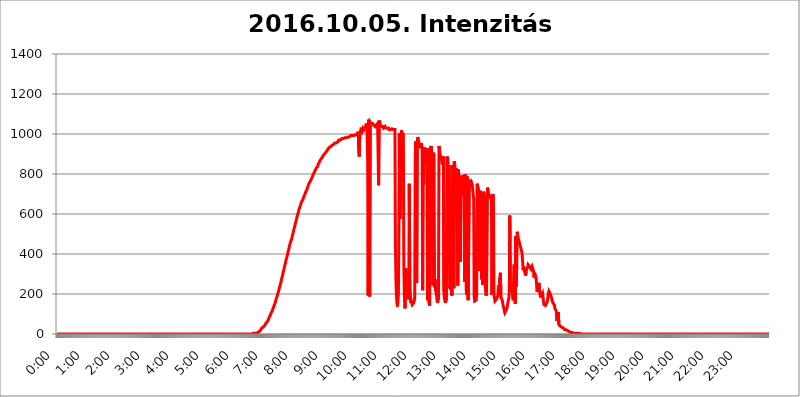
| Category | 2016.10.05. Intenzitás [W/m^2] |
|---|---|
| 0.0 | 0 |
| 0.0006944444444444445 | 0 |
| 0.001388888888888889 | 0 |
| 0.0020833333333333333 | 0 |
| 0.002777777777777778 | 0 |
| 0.003472222222222222 | 0 |
| 0.004166666666666667 | 0 |
| 0.004861111111111111 | 0 |
| 0.005555555555555556 | 0 |
| 0.0062499999999999995 | 0 |
| 0.006944444444444444 | 0 |
| 0.007638888888888889 | 0 |
| 0.008333333333333333 | 0 |
| 0.009027777777777779 | 0 |
| 0.009722222222222222 | 0 |
| 0.010416666666666666 | 0 |
| 0.011111111111111112 | 0 |
| 0.011805555555555555 | 0 |
| 0.012499999999999999 | 0 |
| 0.013194444444444444 | 0 |
| 0.013888888888888888 | 0 |
| 0.014583333333333332 | 0 |
| 0.015277777777777777 | 0 |
| 0.015972222222222224 | 0 |
| 0.016666666666666666 | 0 |
| 0.017361111111111112 | 0 |
| 0.018055555555555557 | 0 |
| 0.01875 | 0 |
| 0.019444444444444445 | 0 |
| 0.02013888888888889 | 0 |
| 0.020833333333333332 | 0 |
| 0.02152777777777778 | 0 |
| 0.022222222222222223 | 0 |
| 0.02291666666666667 | 0 |
| 0.02361111111111111 | 0 |
| 0.024305555555555556 | 0 |
| 0.024999999999999998 | 0 |
| 0.025694444444444447 | 0 |
| 0.02638888888888889 | 0 |
| 0.027083333333333334 | 0 |
| 0.027777777777777776 | 0 |
| 0.02847222222222222 | 0 |
| 0.029166666666666664 | 0 |
| 0.029861111111111113 | 0 |
| 0.030555555555555555 | 0 |
| 0.03125 | 0 |
| 0.03194444444444445 | 0 |
| 0.03263888888888889 | 0 |
| 0.03333333333333333 | 0 |
| 0.034027777777777775 | 0 |
| 0.034722222222222224 | 0 |
| 0.035416666666666666 | 0 |
| 0.036111111111111115 | 0 |
| 0.03680555555555556 | 0 |
| 0.0375 | 0 |
| 0.03819444444444444 | 0 |
| 0.03888888888888889 | 0 |
| 0.03958333333333333 | 0 |
| 0.04027777777777778 | 0 |
| 0.04097222222222222 | 0 |
| 0.041666666666666664 | 0 |
| 0.042361111111111106 | 0 |
| 0.04305555555555556 | 0 |
| 0.043750000000000004 | 0 |
| 0.044444444444444446 | 0 |
| 0.04513888888888889 | 0 |
| 0.04583333333333334 | 0 |
| 0.04652777777777778 | 0 |
| 0.04722222222222222 | 0 |
| 0.04791666666666666 | 0 |
| 0.04861111111111111 | 0 |
| 0.049305555555555554 | 0 |
| 0.049999999999999996 | 0 |
| 0.05069444444444445 | 0 |
| 0.051388888888888894 | 0 |
| 0.052083333333333336 | 0 |
| 0.05277777777777778 | 0 |
| 0.05347222222222222 | 0 |
| 0.05416666666666667 | 0 |
| 0.05486111111111111 | 0 |
| 0.05555555555555555 | 0 |
| 0.05625 | 0 |
| 0.05694444444444444 | 0 |
| 0.057638888888888885 | 0 |
| 0.05833333333333333 | 0 |
| 0.05902777777777778 | 0 |
| 0.059722222222222225 | 0 |
| 0.06041666666666667 | 0 |
| 0.061111111111111116 | 0 |
| 0.06180555555555556 | 0 |
| 0.0625 | 0 |
| 0.06319444444444444 | 0 |
| 0.06388888888888888 | 0 |
| 0.06458333333333334 | 0 |
| 0.06527777777777778 | 0 |
| 0.06597222222222222 | 0 |
| 0.06666666666666667 | 0 |
| 0.06736111111111111 | 0 |
| 0.06805555555555555 | 0 |
| 0.06874999999999999 | 0 |
| 0.06944444444444443 | 0 |
| 0.07013888888888889 | 0 |
| 0.07083333333333333 | 0 |
| 0.07152777777777779 | 0 |
| 0.07222222222222223 | 0 |
| 0.07291666666666667 | 0 |
| 0.07361111111111111 | 0 |
| 0.07430555555555556 | 0 |
| 0.075 | 0 |
| 0.07569444444444444 | 0 |
| 0.0763888888888889 | 0 |
| 0.07708333333333334 | 0 |
| 0.07777777777777778 | 0 |
| 0.07847222222222222 | 0 |
| 0.07916666666666666 | 0 |
| 0.0798611111111111 | 0 |
| 0.08055555555555556 | 0 |
| 0.08125 | 0 |
| 0.08194444444444444 | 0 |
| 0.08263888888888889 | 0 |
| 0.08333333333333333 | 0 |
| 0.08402777777777777 | 0 |
| 0.08472222222222221 | 0 |
| 0.08541666666666665 | 0 |
| 0.08611111111111112 | 0 |
| 0.08680555555555557 | 0 |
| 0.08750000000000001 | 0 |
| 0.08819444444444445 | 0 |
| 0.08888888888888889 | 0 |
| 0.08958333333333333 | 0 |
| 0.09027777777777778 | 0 |
| 0.09097222222222222 | 0 |
| 0.09166666666666667 | 0 |
| 0.09236111111111112 | 0 |
| 0.09305555555555556 | 0 |
| 0.09375 | 0 |
| 0.09444444444444444 | 0 |
| 0.09513888888888888 | 0 |
| 0.09583333333333333 | 0 |
| 0.09652777777777777 | 0 |
| 0.09722222222222222 | 0 |
| 0.09791666666666667 | 0 |
| 0.09861111111111111 | 0 |
| 0.09930555555555555 | 0 |
| 0.09999999999999999 | 0 |
| 0.10069444444444443 | 0 |
| 0.1013888888888889 | 0 |
| 0.10208333333333335 | 0 |
| 0.10277777777777779 | 0 |
| 0.10347222222222223 | 0 |
| 0.10416666666666667 | 0 |
| 0.10486111111111111 | 0 |
| 0.10555555555555556 | 0 |
| 0.10625 | 0 |
| 0.10694444444444444 | 0 |
| 0.1076388888888889 | 0 |
| 0.10833333333333334 | 0 |
| 0.10902777777777778 | 0 |
| 0.10972222222222222 | 0 |
| 0.1111111111111111 | 0 |
| 0.11180555555555556 | 0 |
| 0.11180555555555556 | 0 |
| 0.1125 | 0 |
| 0.11319444444444444 | 0 |
| 0.11388888888888889 | 0 |
| 0.11458333333333333 | 0 |
| 0.11527777777777777 | 0 |
| 0.11597222222222221 | 0 |
| 0.11666666666666665 | 0 |
| 0.1173611111111111 | 0 |
| 0.11805555555555557 | 0 |
| 0.11944444444444445 | 0 |
| 0.12013888888888889 | 0 |
| 0.12083333333333333 | 0 |
| 0.12152777777777778 | 0 |
| 0.12222222222222223 | 0 |
| 0.12291666666666667 | 0 |
| 0.12291666666666667 | 0 |
| 0.12361111111111112 | 0 |
| 0.12430555555555556 | 0 |
| 0.125 | 0 |
| 0.12569444444444444 | 0 |
| 0.12638888888888888 | 0 |
| 0.12708333333333333 | 0 |
| 0.16875 | 0 |
| 0.12847222222222224 | 0 |
| 0.12916666666666668 | 0 |
| 0.12986111111111112 | 0 |
| 0.13055555555555556 | 0 |
| 0.13125 | 0 |
| 0.13194444444444445 | 0 |
| 0.1326388888888889 | 0 |
| 0.13333333333333333 | 0 |
| 0.13402777777777777 | 0 |
| 0.13402777777777777 | 0 |
| 0.13472222222222222 | 0 |
| 0.13541666666666666 | 0 |
| 0.1361111111111111 | 0 |
| 0.13749999999999998 | 0 |
| 0.13819444444444443 | 0 |
| 0.1388888888888889 | 0 |
| 0.13958333333333334 | 0 |
| 0.14027777777777778 | 0 |
| 0.14097222222222222 | 0 |
| 0.14166666666666666 | 0 |
| 0.1423611111111111 | 0 |
| 0.14305555555555557 | 0 |
| 0.14375000000000002 | 0 |
| 0.14444444444444446 | 0 |
| 0.1451388888888889 | 0 |
| 0.1451388888888889 | 0 |
| 0.14652777777777778 | 0 |
| 0.14722222222222223 | 0 |
| 0.14791666666666667 | 0 |
| 0.1486111111111111 | 0 |
| 0.14930555555555555 | 0 |
| 0.15 | 0 |
| 0.15069444444444444 | 0 |
| 0.15138888888888888 | 0 |
| 0.15208333333333332 | 0 |
| 0.15277777777777776 | 0 |
| 0.15347222222222223 | 0 |
| 0.15416666666666667 | 0 |
| 0.15486111111111112 | 0 |
| 0.15555555555555556 | 0 |
| 0.15625 | 0 |
| 0.15694444444444444 | 0 |
| 0.15763888888888888 | 0 |
| 0.15833333333333333 | 0 |
| 0.15902777777777777 | 0 |
| 0.15972222222222224 | 0 |
| 0.16041666666666668 | 0 |
| 0.16111111111111112 | 0 |
| 0.16180555555555556 | 0 |
| 0.1625 | 0 |
| 0.16319444444444445 | 0 |
| 0.1638888888888889 | 0 |
| 0.16458333333333333 | 0 |
| 0.16527777777777777 | 0 |
| 0.16597222222222222 | 0 |
| 0.16666666666666666 | 0 |
| 0.1673611111111111 | 0 |
| 0.16805555555555554 | 0 |
| 0.16874999999999998 | 0 |
| 0.16944444444444443 | 0 |
| 0.17013888888888887 | 0 |
| 0.1708333333333333 | 0 |
| 0.17152777777777775 | 0 |
| 0.17222222222222225 | 0 |
| 0.1729166666666667 | 0 |
| 0.17361111111111113 | 0 |
| 0.17430555555555557 | 0 |
| 0.17500000000000002 | 0 |
| 0.17569444444444446 | 0 |
| 0.1763888888888889 | 0 |
| 0.17708333333333334 | 0 |
| 0.17777777777777778 | 0 |
| 0.17847222222222223 | 0 |
| 0.17916666666666667 | 0 |
| 0.1798611111111111 | 0 |
| 0.18055555555555555 | 0 |
| 0.18125 | 0 |
| 0.18194444444444444 | 0 |
| 0.1826388888888889 | 0 |
| 0.18333333333333335 | 0 |
| 0.1840277777777778 | 0 |
| 0.18472222222222223 | 0 |
| 0.18541666666666667 | 0 |
| 0.18611111111111112 | 0 |
| 0.18680555555555556 | 0 |
| 0.1875 | 0 |
| 0.18819444444444444 | 0 |
| 0.18888888888888888 | 0 |
| 0.18958333333333333 | 0 |
| 0.19027777777777777 | 0 |
| 0.1909722222222222 | 0 |
| 0.19166666666666665 | 0 |
| 0.19236111111111112 | 0 |
| 0.19305555555555554 | 0 |
| 0.19375 | 0 |
| 0.19444444444444445 | 0 |
| 0.1951388888888889 | 0 |
| 0.19583333333333333 | 0 |
| 0.19652777777777777 | 0 |
| 0.19722222222222222 | 0 |
| 0.19791666666666666 | 0 |
| 0.1986111111111111 | 0 |
| 0.19930555555555554 | 0 |
| 0.19999999999999998 | 0 |
| 0.20069444444444443 | 0 |
| 0.20138888888888887 | 0 |
| 0.2020833333333333 | 0 |
| 0.2027777777777778 | 0 |
| 0.2034722222222222 | 0 |
| 0.2041666666666667 | 0 |
| 0.20486111111111113 | 0 |
| 0.20555555555555557 | 0 |
| 0.20625000000000002 | 0 |
| 0.20694444444444446 | 0 |
| 0.2076388888888889 | 0 |
| 0.20833333333333334 | 0 |
| 0.20902777777777778 | 0 |
| 0.20972222222222223 | 0 |
| 0.21041666666666667 | 0 |
| 0.2111111111111111 | 0 |
| 0.21180555555555555 | 0 |
| 0.2125 | 0 |
| 0.21319444444444444 | 0 |
| 0.2138888888888889 | 0 |
| 0.21458333333333335 | 0 |
| 0.2152777777777778 | 0 |
| 0.21597222222222223 | 0 |
| 0.21666666666666667 | 0 |
| 0.21736111111111112 | 0 |
| 0.21805555555555556 | 0 |
| 0.21875 | 0 |
| 0.21944444444444444 | 0 |
| 0.22013888888888888 | 0 |
| 0.22083333333333333 | 0 |
| 0.22152777777777777 | 0 |
| 0.2222222222222222 | 0 |
| 0.22291666666666665 | 0 |
| 0.2236111111111111 | 0 |
| 0.22430555555555556 | 0 |
| 0.225 | 0 |
| 0.22569444444444445 | 0 |
| 0.2263888888888889 | 0 |
| 0.22708333333333333 | 0 |
| 0.22777777777777777 | 0 |
| 0.22847222222222222 | 0 |
| 0.22916666666666666 | 0 |
| 0.2298611111111111 | 0 |
| 0.23055555555555554 | 0 |
| 0.23124999999999998 | 0 |
| 0.23194444444444443 | 0 |
| 0.23263888888888887 | 0 |
| 0.2333333333333333 | 0 |
| 0.2340277777777778 | 0 |
| 0.2347222222222222 | 0 |
| 0.2354166666666667 | 0 |
| 0.23611111111111113 | 0 |
| 0.23680555555555557 | 0 |
| 0.23750000000000002 | 0 |
| 0.23819444444444446 | 0 |
| 0.2388888888888889 | 0 |
| 0.23958333333333334 | 0 |
| 0.24027777777777778 | 0 |
| 0.24097222222222223 | 0 |
| 0.24166666666666667 | 0 |
| 0.2423611111111111 | 0 |
| 0.24305555555555555 | 0 |
| 0.24375 | 0 |
| 0.24444444444444446 | 0 |
| 0.24513888888888888 | 0 |
| 0.24583333333333335 | 0 |
| 0.2465277777777778 | 0 |
| 0.24722222222222223 | 0 |
| 0.24791666666666667 | 0 |
| 0.24861111111111112 | 0 |
| 0.24930555555555556 | 0 |
| 0.25 | 0 |
| 0.25069444444444444 | 0 |
| 0.2513888888888889 | 0 |
| 0.2520833333333333 | 0 |
| 0.25277777777777777 | 0 |
| 0.2534722222222222 | 0 |
| 0.25416666666666665 | 0 |
| 0.2548611111111111 | 0 |
| 0.2555555555555556 | 0 |
| 0.25625000000000003 | 0 |
| 0.2569444444444445 | 0 |
| 0.2576388888888889 | 0 |
| 0.25833333333333336 | 0 |
| 0.2590277777777778 | 0 |
| 0.25972222222222224 | 0 |
| 0.2604166666666667 | 0 |
| 0.2611111111111111 | 0 |
| 0.26180555555555557 | 0 |
| 0.2625 | 0 |
| 0.26319444444444445 | 0 |
| 0.2638888888888889 | 0 |
| 0.26458333333333334 | 0 |
| 0.2652777777777778 | 0 |
| 0.2659722222222222 | 0 |
| 0.26666666666666666 | 0 |
| 0.2673611111111111 | 0 |
| 0.26805555555555555 | 0 |
| 0.26875 | 0 |
| 0.26944444444444443 | 0 |
| 0.2701388888888889 | 0 |
| 0.2708333333333333 | 0 |
| 0.27152777777777776 | 0 |
| 0.2722222222222222 | 0 |
| 0.27291666666666664 | 0 |
| 0.2736111111111111 | 0 |
| 0.2743055555555555 | 3.525 |
| 0.27499999999999997 | 3.525 |
| 0.27569444444444446 | 3.525 |
| 0.27638888888888885 | 3.525 |
| 0.27708333333333335 | 3.525 |
| 0.2777777777777778 | 3.525 |
| 0.27847222222222223 | 3.525 |
| 0.2791666666666667 | 3.525 |
| 0.2798611111111111 | 3.525 |
| 0.28055555555555556 | 7.887 |
| 0.28125 | 7.887 |
| 0.28194444444444444 | 7.887 |
| 0.2826388888888889 | 12.257 |
| 0.2833333333333333 | 12.257 |
| 0.28402777777777777 | 12.257 |
| 0.2847222222222222 | 12.257 |
| 0.28541666666666665 | 21.024 |
| 0.28611111111111115 | 25.419 |
| 0.28680555555555554 | 29.823 |
| 0.28750000000000003 | 29.823 |
| 0.2881944444444445 | 34.234 |
| 0.2888888888888889 | 34.234 |
| 0.28958333333333336 | 38.653 |
| 0.2902777777777778 | 38.653 |
| 0.29097222222222224 | 43.079 |
| 0.2916666666666667 | 47.511 |
| 0.2923611111111111 | 51.951 |
| 0.29305555555555557 | 56.398 |
| 0.29375 | 56.398 |
| 0.29444444444444445 | 60.85 |
| 0.2951388888888889 | 65.31 |
| 0.29583333333333334 | 69.775 |
| 0.2965277777777778 | 74.246 |
| 0.2972222222222222 | 83.205 |
| 0.29791666666666666 | 87.692 |
| 0.2986111111111111 | 92.184 |
| 0.29930555555555555 | 96.682 |
| 0.3 | 105.69 |
| 0.30069444444444443 | 110.201 |
| 0.3013888888888889 | 114.716 |
| 0.3020833333333333 | 119.235 |
| 0.30277777777777776 | 128.284 |
| 0.3034722222222222 | 132.814 |
| 0.30416666666666664 | 141.884 |
| 0.3048611111111111 | 146.423 |
| 0.3055555555555555 | 155.509 |
| 0.30624999999999997 | 160.056 |
| 0.3069444444444444 | 173.709 |
| 0.3076388888888889 | 178.264 |
| 0.30833333333333335 | 187.378 |
| 0.3090277777777778 | 196.497 |
| 0.30972222222222223 | 205.62 |
| 0.3104166666666667 | 214.746 |
| 0.3111111111111111 | 223.873 |
| 0.31180555555555556 | 233 |
| 0.3125 | 242.127 |
| 0.31319444444444444 | 251.251 |
| 0.3138888888888889 | 260.373 |
| 0.3145833333333333 | 274.047 |
| 0.31527777777777777 | 283.156 |
| 0.3159722222222222 | 292.259 |
| 0.31666666666666665 | 305.898 |
| 0.31736111111111115 | 314.98 |
| 0.31805555555555554 | 324.052 |
| 0.31875000000000003 | 337.639 |
| 0.3194444444444445 | 346.682 |
| 0.3201388888888889 | 355.712 |
| 0.32083333333333336 | 369.23 |
| 0.3215277777777778 | 378.224 |
| 0.32222222222222224 | 387.202 |
| 0.3229166666666667 | 396.164 |
| 0.3236111111111111 | 409.574 |
| 0.32430555555555557 | 418.492 |
| 0.325 | 427.39 |
| 0.32569444444444445 | 440.702 |
| 0.3263888888888889 | 449.551 |
| 0.32708333333333334 | 458.38 |
| 0.3277777777777778 | 462.786 |
| 0.3284722222222222 | 471.582 |
| 0.32916666666666666 | 480.356 |
| 0.3298611111111111 | 493.475 |
| 0.33055555555555555 | 502.192 |
| 0.33125 | 510.885 |
| 0.33194444444444443 | 523.88 |
| 0.3326388888888889 | 532.513 |
| 0.3333333333333333 | 541.121 |
| 0.3340277777777778 | 553.986 |
| 0.3347222222222222 | 558.261 |
| 0.3354166666666667 | 571.049 |
| 0.3361111111111111 | 583.779 |
| 0.3368055555555556 | 592.233 |
| 0.33749999999999997 | 600.661 |
| 0.33819444444444446 | 609.062 |
| 0.33888888888888885 | 621.613 |
| 0.33958333333333335 | 625.784 |
| 0.34027777777777773 | 634.105 |
| 0.34097222222222223 | 642.4 |
| 0.3416666666666666 | 646.537 |
| 0.3423611111111111 | 658.909 |
| 0.3430555555555555 | 663.019 |
| 0.34375 | 663.019 |
| 0.3444444444444445 | 671.22 |
| 0.3451388888888889 | 679.395 |
| 0.3458333333333334 | 683.473 |
| 0.34652777777777777 | 691.608 |
| 0.34722222222222227 | 695.666 |
| 0.34791666666666665 | 703.762 |
| 0.34861111111111115 | 711.832 |
| 0.34930555555555554 | 715.858 |
| 0.35000000000000003 | 719.877 |
| 0.3506944444444444 | 727.896 |
| 0.3513888888888889 | 735.89 |
| 0.3520833333333333 | 743.859 |
| 0.3527777777777778 | 743.859 |
| 0.3534722222222222 | 747.834 |
| 0.3541666666666667 | 759.723 |
| 0.3548611111111111 | 763.674 |
| 0.35555555555555557 | 767.62 |
| 0.35625 | 771.559 |
| 0.35694444444444445 | 779.42 |
| 0.3576388888888889 | 783.342 |
| 0.35833333333333334 | 791.169 |
| 0.3590277777777778 | 798.974 |
| 0.3597222222222222 | 802.868 |
| 0.36041666666666666 | 806.757 |
| 0.3611111111111111 | 814.519 |
| 0.36180555555555555 | 818.392 |
| 0.3625 | 822.26 |
| 0.36319444444444443 | 829.981 |
| 0.3638888888888889 | 833.834 |
| 0.3645833333333333 | 833.834 |
| 0.3652777777777778 | 837.682 |
| 0.3659722222222222 | 849.199 |
| 0.3666666666666667 | 853.029 |
| 0.3673611111111111 | 856.855 |
| 0.3680555555555556 | 864.493 |
| 0.36874999999999997 | 864.493 |
| 0.36944444444444446 | 872.114 |
| 0.37013888888888885 | 872.114 |
| 0.37083333333333335 | 875.918 |
| 0.37152777777777773 | 883.516 |
| 0.37222222222222223 | 887.309 |
| 0.3729166666666666 | 891.099 |
| 0.3736111111111111 | 894.885 |
| 0.3743055555555555 | 898.668 |
| 0.375 | 894.885 |
| 0.3756944444444445 | 902.447 |
| 0.3763888888888889 | 906.223 |
| 0.3770833333333334 | 906.223 |
| 0.37777777777777777 | 913.766 |
| 0.37847222222222227 | 917.534 |
| 0.37916666666666665 | 917.534 |
| 0.37986111111111115 | 925.06 |
| 0.38055555555555554 | 928.819 |
| 0.38125000000000003 | 932.576 |
| 0.3819444444444444 | 932.576 |
| 0.3826388888888889 | 932.576 |
| 0.3833333333333333 | 936.33 |
| 0.3840277777777778 | 936.33 |
| 0.3847222222222222 | 940.082 |
| 0.3854166666666667 | 943.832 |
| 0.3861111111111111 | 943.832 |
| 0.38680555555555557 | 943.832 |
| 0.3875 | 947.58 |
| 0.38819444444444445 | 951.327 |
| 0.3888888888888889 | 955.071 |
| 0.38958333333333334 | 955.071 |
| 0.3902777777777778 | 958.814 |
| 0.3909722222222222 | 955.071 |
| 0.39166666666666666 | 958.814 |
| 0.3923611111111111 | 958.814 |
| 0.39305555555555555 | 958.814 |
| 0.39375 | 962.555 |
| 0.39444444444444443 | 962.555 |
| 0.3951388888888889 | 970.034 |
| 0.3958333333333333 | 970.034 |
| 0.3965277777777778 | 973.772 |
| 0.3972222222222222 | 970.034 |
| 0.3979166666666667 | 973.772 |
| 0.3986111111111111 | 973.772 |
| 0.3993055555555556 | 977.508 |
| 0.39999999999999997 | 973.772 |
| 0.40069444444444446 | 977.508 |
| 0.40138888888888885 | 977.508 |
| 0.40208333333333335 | 977.508 |
| 0.40277777777777773 | 977.508 |
| 0.40347222222222223 | 981.244 |
| 0.4041666666666666 | 984.98 |
| 0.4048611111111111 | 984.98 |
| 0.4055555555555555 | 981.244 |
| 0.40625 | 984.98 |
| 0.4069444444444445 | 984.98 |
| 0.4076388888888889 | 984.98 |
| 0.4083333333333334 | 984.98 |
| 0.40902777777777777 | 984.98 |
| 0.40972222222222227 | 984.98 |
| 0.41041666666666665 | 984.98 |
| 0.41111111111111115 | 984.98 |
| 0.41180555555555554 | 992.448 |
| 0.41250000000000003 | 988.714 |
| 0.4131944444444444 | 988.714 |
| 0.4138888888888889 | 992.448 |
| 0.4145833333333333 | 988.714 |
| 0.4152777777777778 | 992.448 |
| 0.4159722222222222 | 992.448 |
| 0.4166666666666667 | 992.448 |
| 0.4173611111111111 | 996.182 |
| 0.41805555555555557 | 996.182 |
| 0.41875 | 992.448 |
| 0.41944444444444445 | 996.182 |
| 0.4201388888888889 | 996.182 |
| 0.42083333333333334 | 992.448 |
| 0.4215277777777778 | 996.182 |
| 0.4222222222222222 | 1011.118 |
| 0.42291666666666666 | 917.534 |
| 0.4236111111111111 | 887.309 |
| 0.42430555555555555 | 1011.118 |
| 0.425 | 1003.65 |
| 0.42569444444444443 | 1018.587 |
| 0.4263888888888889 | 1014.852 |
| 0.4270833333333333 | 1011.118 |
| 0.4277777777777778 | 1022.323 |
| 0.4284722222222222 | 1029.798 |
| 0.4291666666666667 | 1026.06 |
| 0.4298611111111111 | 1022.323 |
| 0.4305555555555556 | 1029.798 |
| 0.43124999999999997 | 1029.798 |
| 0.43194444444444446 | 1033.537 |
| 0.43263888888888885 | 1037.277 |
| 0.43333333333333335 | 1052.255 |
| 0.43402777777777773 | 1037.277 |
| 0.43472222222222223 | 996.182 |
| 0.4354166666666666 | 849.199 |
| 0.4361111111111111 | 191.937 |
| 0.4368055555555555 | 1071.027 |
| 0.4375 | 856.855 |
| 0.4381944444444445 | 187.378 |
| 0.4388888888888889 | 1059.756 |
| 0.4395833333333334 | 1059.756 |
| 0.44027777777777777 | 1052.255 |
| 0.44097222222222227 | 1052.255 |
| 0.44166666666666665 | 1052.255 |
| 0.44236111111111115 | 1052.255 |
| 0.44305555555555554 | 1048.508 |
| 0.44375000000000003 | 1044.762 |
| 0.4444444444444444 | 1044.762 |
| 0.4451388888888889 | 1041.019 |
| 0.4458333333333333 | 1037.277 |
| 0.4465277777777778 | 1041.019 |
| 0.4472222222222222 | 1044.762 |
| 0.4479166666666667 | 1041.019 |
| 0.4486111111111111 | 1044.762 |
| 0.44930555555555557 | 1052.255 |
| 0.45 | 1052.255 |
| 0.45069444444444445 | 743.859 |
| 0.4513888888888889 | 1067.267 |
| 0.45208333333333334 | 1063.51 |
| 0.4527777777777778 | 1052.255 |
| 0.4534722222222222 | 1044.762 |
| 0.45416666666666666 | 1044.762 |
| 0.4548611111111111 | 1037.277 |
| 0.45555555555555555 | 1037.277 |
| 0.45625 | 1037.277 |
| 0.45694444444444443 | 1037.277 |
| 0.4576388888888889 | 1029.798 |
| 0.4583333333333333 | 1029.798 |
| 0.4590277777777778 | 1033.537 |
| 0.4597222222222222 | 1037.277 |
| 0.4604166666666667 | 1029.798 |
| 0.4611111111111111 | 1033.537 |
| 0.4618055555555556 | 1033.537 |
| 0.46249999999999997 | 1029.798 |
| 0.46319444444444446 | 1033.537 |
| 0.46388888888888885 | 1033.537 |
| 0.46458333333333335 | 1029.798 |
| 0.46527777777777773 | 1022.323 |
| 0.46597222222222223 | 1022.323 |
| 0.4666666666666666 | 1022.323 |
| 0.4673611111111111 | 1022.323 |
| 0.4680555555555555 | 1022.323 |
| 0.46875 | 1022.323 |
| 0.4694444444444445 | 1026.06 |
| 0.4701388888888889 | 1029.798 |
| 0.4708333333333334 | 1026.06 |
| 0.47152777777777777 | 1022.323 |
| 0.47222222222222227 | 1018.587 |
| 0.47291666666666665 | 1022.323 |
| 0.47361111111111115 | 1022.323 |
| 0.47430555555555554 | 445.129 |
| 0.47500000000000003 | 278.603 |
| 0.4756944444444444 | 196.497 |
| 0.4763888888888889 | 155.509 |
| 0.4770833333333333 | 137.347 |
| 0.4777777777777778 | 164.605 |
| 0.4784722222222222 | 196.497 |
| 0.4791666666666667 | 515.223 |
| 0.4798611111111111 | 1003.65 |
| 0.48055555555555557 | 575.299 |
| 0.48125 | 747.834 |
| 0.48194444444444445 | 925.06 |
| 0.4826388888888889 | 1018.587 |
| 0.48333333333333334 | 1007.383 |
| 0.4840277777777778 | 1007.383 |
| 0.4847222222222222 | 1007.383 |
| 0.48541666666666666 | 999.916 |
| 0.4861111111111111 | 342.162 |
| 0.48680555555555555 | 201.058 |
| 0.4875 | 128.284 |
| 0.48819444444444443 | 141.884 |
| 0.4888888888888889 | 328.584 |
| 0.4895833333333333 | 187.378 |
| 0.4902777777777778 | 210.182 |
| 0.4909722222222222 | 182.82 |
| 0.4916666666666667 | 173.709 |
| 0.4923611111111111 | 191.937 |
| 0.4930555555555556 | 210.182 |
| 0.49374999999999997 | 751.803 |
| 0.49444444444444446 | 296.808 |
| 0.49513888888888885 | 196.497 |
| 0.49583333333333335 | 155.509 |
| 0.49652777777777773 | 164.605 |
| 0.49722222222222223 | 155.509 |
| 0.4979166666666666 | 146.423 |
| 0.4986111111111111 | 150.964 |
| 0.4993055555555555 | 150.964 |
| 0.5 | 155.509 |
| 0.5006944444444444 | 164.605 |
| 0.5013888888888889 | 187.378 |
| 0.5020833333333333 | 875.918 |
| 0.5027777777777778 | 962.555 |
| 0.5034722222222222 | 296.808 |
| 0.5041666666666667 | 255.813 |
| 0.5048611111111111 | 955.071 |
| 0.5055555555555555 | 984.98 |
| 0.50625 | 973.772 |
| 0.5069444444444444 | 962.555 |
| 0.5076388888888889 | 951.327 |
| 0.5083333333333333 | 947.58 |
| 0.5090277777777777 | 940.082 |
| 0.5097222222222222 | 928.819 |
| 0.5104166666666666 | 955.071 |
| 0.5111111111111112 | 943.832 |
| 0.5118055555555555 | 932.576 |
| 0.5125000000000001 | 219.309 |
| 0.5131944444444444 | 932.576 |
| 0.513888888888889 | 747.834 |
| 0.5145833333333333 | 932.576 |
| 0.5152777777777778 | 928.819 |
| 0.5159722222222222 | 921.298 |
| 0.5166666666666667 | 909.996 |
| 0.517361111111111 | 925.06 |
| 0.5180555555555556 | 853.029 |
| 0.5187499999999999 | 928.819 |
| 0.5194444444444445 | 169.156 |
| 0.5201388888888888 | 178.264 |
| 0.5208333333333334 | 872.114 |
| 0.5215277777777778 | 155.509 |
| 0.5222222222222223 | 141.884 |
| 0.5229166666666667 | 887.309 |
| 0.5236111111111111 | 932.576 |
| 0.5243055555555556 | 940.082 |
| 0.525 | 943.832 |
| 0.5256944444444445 | 883.516 |
| 0.5263888888888889 | 440.702 |
| 0.5270833333333333 | 242.127 |
| 0.5277777777777778 | 906.223 |
| 0.5284722222222222 | 860.676 |
| 0.5291666666666667 | 233 |
| 0.5298611111111111 | 274.047 |
| 0.5305555555555556 | 219.309 |
| 0.53125 | 214.746 |
| 0.5319444444444444 | 196.497 |
| 0.5326388888888889 | 169.156 |
| 0.5333333333333333 | 155.509 |
| 0.5340277777777778 | 160.056 |
| 0.5347222222222222 | 182.82 |
| 0.5354166666666667 | 940.082 |
| 0.5361111111111111 | 925.06 |
| 0.5368055555555555 | 902.447 |
| 0.5375 | 891.099 |
| 0.5381944444444444 | 875.918 |
| 0.5388888888888889 | 879.719 |
| 0.5395833333333333 | 864.493 |
| 0.5402777777777777 | 845.365 |
| 0.5409722222222222 | 860.676 |
| 0.5416666666666666 | 887.309 |
| 0.5423611111111112 | 210.182 |
| 0.5430555555555555 | 178.264 |
| 0.5437500000000001 | 164.605 |
| 0.5444444444444444 | 155.509 |
| 0.545138888888889 | 160.056 |
| 0.5458333333333333 | 178.264 |
| 0.5465277777777778 | 887.309 |
| 0.5472222222222222 | 887.309 |
| 0.5479166666666667 | 872.114 |
| 0.548611111111111 | 346.682 |
| 0.5493055555555556 | 845.365 |
| 0.5499999999999999 | 845.365 |
| 0.5506944444444445 | 228.436 |
| 0.5513888888888888 | 251.251 |
| 0.5520833333333334 | 219.309 |
| 0.5527777777777778 | 360.221 |
| 0.5534722222222223 | 191.937 |
| 0.5541666666666667 | 845.365 |
| 0.5548611111111111 | 841.526 |
| 0.5555555555555556 | 826.123 |
| 0.55625 | 228.436 |
| 0.5569444444444445 | 864.493 |
| 0.5576388888888889 | 845.365 |
| 0.5583333333333333 | 600.661 |
| 0.5590277777777778 | 829.981 |
| 0.5597222222222222 | 814.519 |
| 0.5604166666666667 | 798.974 |
| 0.5611111111111111 | 502.192 |
| 0.5618055555555556 | 242.127 |
| 0.5625 | 822.26 |
| 0.5631944444444444 | 795.074 |
| 0.5638888888888889 | 771.559 |
| 0.5645833333333333 | 735.89 |
| 0.5652777777777778 | 360.221 |
| 0.5659722222222222 | 791.169 |
| 0.5666666666666667 | 791.169 |
| 0.5673611111111111 | 795.074 |
| 0.5680555555555555 | 691.608 |
| 0.56875 | 723.889 |
| 0.5694444444444444 | 795.074 |
| 0.5701388888888889 | 787.258 |
| 0.5708333333333333 | 791.169 |
| 0.5715277777777777 | 260.373 |
| 0.5722222222222222 | 798.974 |
| 0.5729166666666666 | 779.42 |
| 0.5736111111111112 | 219.309 |
| 0.5743055555555555 | 196.497 |
| 0.5750000000000001 | 787.258 |
| 0.5756944444444444 | 196.497 |
| 0.576388888888889 | 169.156 |
| 0.5770833333333333 | 169.156 |
| 0.5777777777777778 | 771.559 |
| 0.5784722222222222 | 755.766 |
| 0.5791666666666667 | 751.803 |
| 0.579861111111111 | 751.803 |
| 0.5805555555555556 | 747.834 |
| 0.5812499999999999 | 755.766 |
| 0.5819444444444445 | 747.834 |
| 0.5826388888888888 | 743.859 |
| 0.5833333333333334 | 751.803 |
| 0.5840277777777778 | 675.311 |
| 0.5847222222222223 | 187.378 |
| 0.5854166666666667 | 164.605 |
| 0.5861111111111111 | 164.605 |
| 0.5868055555555556 | 164.605 |
| 0.5875 | 169.156 |
| 0.5881944444444445 | 196.497 |
| 0.5888888888888889 | 751.803 |
| 0.5895833333333333 | 747.834 |
| 0.5902777777777778 | 727.896 |
| 0.5909722222222222 | 719.877 |
| 0.5916666666666667 | 719.877 |
| 0.5923611111111111 | 314.98 |
| 0.5930555555555556 | 715.858 |
| 0.59375 | 562.53 |
| 0.5944444444444444 | 609.062 |
| 0.5951388888888889 | 274.047 |
| 0.5958333333333333 | 382.715 |
| 0.5965277777777778 | 246.689 |
| 0.5972222222222222 | 687.544 |
| 0.5979166666666667 | 711.832 |
| 0.5986111111111111 | 703.762 |
| 0.5993055555555555 | 691.608 |
| 0.6 | 409.574 |
| 0.6006944444444444 | 219.309 |
| 0.6013888888888889 | 191.937 |
| 0.6020833333333333 | 201.058 |
| 0.6027777777777777 | 422.943 |
| 0.6034722222222222 | 731.896 |
| 0.6041666666666666 | 719.877 |
| 0.6048611111111112 | 703.762 |
| 0.6055555555555555 | 703.762 |
| 0.6062500000000001 | 691.608 |
| 0.6069444444444444 | 687.544 |
| 0.607638888888889 | 683.473 |
| 0.6083333333333333 | 679.395 |
| 0.6090277777777778 | 667.123 |
| 0.6097222222222222 | 196.497 |
| 0.6104166666666667 | 691.608 |
| 0.611111111111111 | 699.717 |
| 0.6118055555555556 | 667.123 |
| 0.6124999999999999 | 201.058 |
| 0.6131944444444445 | 182.82 |
| 0.6138888888888888 | 164.605 |
| 0.6145833333333334 | 164.605 |
| 0.6152777777777778 | 169.156 |
| 0.6159722222222223 | 173.709 |
| 0.6166666666666667 | 173.709 |
| 0.6173611111111111 | 178.264 |
| 0.6180555555555556 | 191.937 |
| 0.61875 | 242.127 |
| 0.6194444444444445 | 201.058 |
| 0.6201388888888889 | 205.62 |
| 0.6208333333333333 | 283.156 |
| 0.6215277777777778 | 305.898 |
| 0.6222222222222222 | 182.82 |
| 0.6229166666666667 | 178.264 |
| 0.6236111111111111 | 173.709 |
| 0.6243055555555556 | 164.605 |
| 0.625 | 150.964 |
| 0.6256944444444444 | 137.347 |
| 0.6263888888888889 | 128.284 |
| 0.6270833333333333 | 114.716 |
| 0.6277777777777778 | 105.69 |
| 0.6284722222222222 | 101.184 |
| 0.6291666666666667 | 114.716 |
| 0.6298611111111111 | 119.235 |
| 0.6305555555555555 | 128.284 |
| 0.63125 | 137.347 |
| 0.6319444444444444 | 155.509 |
| 0.6326388888888889 | 169.156 |
| 0.6333333333333333 | 178.264 |
| 0.6340277777777777 | 210.182 |
| 0.6347222222222222 | 592.233 |
| 0.6354166666666666 | 264.932 |
| 0.6361111111111112 | 228.436 |
| 0.6368055555555555 | 228.436 |
| 0.6375000000000001 | 223.873 |
| 0.6381944444444444 | 205.62 |
| 0.638888888888889 | 182.82 |
| 0.6395833333333333 | 169.156 |
| 0.6402777777777778 | 169.156 |
| 0.6409722222222222 | 346.682 |
| 0.6416666666666667 | 264.932 |
| 0.642361111111111 | 150.964 |
| 0.6430555555555556 | 489.108 |
| 0.6437499999999999 | 237.564 |
| 0.6444444444444445 | 342.162 |
| 0.6451388888888888 | 510.885 |
| 0.6458333333333334 | 493.475 |
| 0.6465277777777778 | 480.356 |
| 0.6472222222222223 | 480.356 |
| 0.6479166666666667 | 462.786 |
| 0.6486111111111111 | 449.551 |
| 0.6493055555555556 | 440.702 |
| 0.65 | 431.833 |
| 0.6506944444444445 | 427.39 |
| 0.6513888888888889 | 414.035 |
| 0.6520833333333333 | 396.164 |
| 0.6527777777777778 | 355.712 |
| 0.6534722222222222 | 319.517 |
| 0.6541666666666667 | 337.639 |
| 0.6548611111111111 | 319.517 |
| 0.6555555555555556 | 314.98 |
| 0.65625 | 301.354 |
| 0.6569444444444444 | 292.259 |
| 0.6576388888888889 | 310.44 |
| 0.6583333333333333 | 324.052 |
| 0.6590277777777778 | 319.517 |
| 0.6597222222222222 | 333.113 |
| 0.6604166666666667 | 346.682 |
| 0.6611111111111111 | 346.682 |
| 0.6618055555555555 | 342.162 |
| 0.6625 | 337.639 |
| 0.6631944444444444 | 333.113 |
| 0.6638888888888889 | 337.639 |
| 0.6645833333333333 | 324.052 |
| 0.6652777777777777 | 328.584 |
| 0.6659722222222222 | 337.639 |
| 0.6666666666666666 | 333.113 |
| 0.6673611111111111 | 333.113 |
| 0.6680555555555556 | 314.98 |
| 0.6687500000000001 | 283.156 |
| 0.6694444444444444 | 305.898 |
| 0.6701388888888888 | 305.898 |
| 0.6708333333333334 | 301.354 |
| 0.6715277777777778 | 278.603 |
| 0.6722222222222222 | 251.251 |
| 0.6729166666666666 | 210.182 |
| 0.6736111111111112 | 219.309 |
| 0.6743055555555556 | 228.436 |
| 0.6749999999999999 | 242.127 |
| 0.6756944444444444 | 255.813 |
| 0.6763888888888889 | 214.746 |
| 0.6770833333333334 | 210.182 |
| 0.6777777777777777 | 182.82 |
| 0.6784722222222223 | 191.937 |
| 0.6791666666666667 | 191.937 |
| 0.6798611111111111 | 196.497 |
| 0.6805555555555555 | 205.62 |
| 0.68125 | 187.378 |
| 0.6819444444444445 | 164.605 |
| 0.6826388888888889 | 146.423 |
| 0.6833333333333332 | 150.964 |
| 0.6840277777777778 | 146.423 |
| 0.6847222222222222 | 141.884 |
| 0.6854166666666667 | 146.423 |
| 0.686111111111111 | 150.964 |
| 0.6868055555555556 | 155.509 |
| 0.6875 | 164.605 |
| 0.6881944444444444 | 169.156 |
| 0.688888888888889 | 205.62 |
| 0.6895833333333333 | 214.746 |
| 0.6902777777777778 | 210.182 |
| 0.6909722222222222 | 205.62 |
| 0.6916666666666668 | 201.058 |
| 0.6923611111111111 | 191.937 |
| 0.6930555555555555 | 182.82 |
| 0.69375 | 173.709 |
| 0.6944444444444445 | 164.605 |
| 0.6951388888888889 | 155.509 |
| 0.6958333333333333 | 150.964 |
| 0.6965277777777777 | 150.964 |
| 0.6972222222222223 | 146.423 |
| 0.6979166666666666 | 128.284 |
| 0.6986111111111111 | 132.814 |
| 0.6993055555555556 | 119.235 |
| 0.7000000000000001 | 110.201 |
| 0.7006944444444444 | 65.31 |
| 0.7013888888888888 | 60.85 |
| 0.7020833333333334 | 92.184 |
| 0.7027777777777778 | 110.201 |
| 0.7034722222222222 | 47.511 |
| 0.7041666666666666 | 43.079 |
| 0.7048611111111112 | 43.079 |
| 0.7055555555555556 | 38.653 |
| 0.7062499999999999 | 38.653 |
| 0.7069444444444444 | 38.653 |
| 0.7076388888888889 | 34.234 |
| 0.7083333333333334 | 34.234 |
| 0.7090277777777777 | 29.823 |
| 0.7097222222222223 | 29.823 |
| 0.7104166666666667 | 25.419 |
| 0.7111111111111111 | 25.419 |
| 0.7118055555555555 | 21.024 |
| 0.7125 | 21.024 |
| 0.7131944444444445 | 21.024 |
| 0.7138888888888889 | 21.024 |
| 0.7145833333333332 | 21.024 |
| 0.7152777777777778 | 16.636 |
| 0.7159722222222222 | 16.636 |
| 0.7166666666666667 | 12.257 |
| 0.717361111111111 | 12.257 |
| 0.7180555555555556 | 12.257 |
| 0.71875 | 12.257 |
| 0.7194444444444444 | 7.887 |
| 0.720138888888889 | 7.887 |
| 0.7208333333333333 | 7.887 |
| 0.7215277777777778 | 7.887 |
| 0.7222222222222222 | 7.887 |
| 0.7229166666666668 | 7.887 |
| 0.7236111111111111 | 3.525 |
| 0.7243055555555555 | 3.525 |
| 0.725 | 3.525 |
| 0.7256944444444445 | 3.525 |
| 0.7263888888888889 | 3.525 |
| 0.7270833333333333 | 3.525 |
| 0.7277777777777777 | 3.525 |
| 0.7284722222222223 | 3.525 |
| 0.7291666666666666 | 3.525 |
| 0.7298611111111111 | 3.525 |
| 0.7305555555555556 | 3.525 |
| 0.7312500000000001 | 3.525 |
| 0.7319444444444444 | 3.525 |
| 0.7326388888888888 | 3.525 |
| 0.7333333333333334 | 0 |
| 0.7340277777777778 | 3.525 |
| 0.7347222222222222 | 0 |
| 0.7354166666666666 | 0 |
| 0.7361111111111112 | 0 |
| 0.7368055555555556 | 0 |
| 0.7374999999999999 | 0 |
| 0.7381944444444444 | 0 |
| 0.7388888888888889 | 0 |
| 0.7395833333333334 | 0 |
| 0.7402777777777777 | 0 |
| 0.7409722222222223 | 0 |
| 0.7416666666666667 | 0 |
| 0.7423611111111111 | 0 |
| 0.7430555555555555 | 0 |
| 0.74375 | 0 |
| 0.7444444444444445 | 0 |
| 0.7451388888888889 | 0 |
| 0.7458333333333332 | 0 |
| 0.7465277777777778 | 0 |
| 0.7472222222222222 | 0 |
| 0.7479166666666667 | 0 |
| 0.748611111111111 | 0 |
| 0.7493055555555556 | 0 |
| 0.75 | 0 |
| 0.7506944444444444 | 0 |
| 0.751388888888889 | 0 |
| 0.7520833333333333 | 0 |
| 0.7527777777777778 | 0 |
| 0.7534722222222222 | 0 |
| 0.7541666666666668 | 0 |
| 0.7548611111111111 | 0 |
| 0.7555555555555555 | 0 |
| 0.75625 | 0 |
| 0.7569444444444445 | 0 |
| 0.7576388888888889 | 0 |
| 0.7583333333333333 | 0 |
| 0.7590277777777777 | 0 |
| 0.7597222222222223 | 0 |
| 0.7604166666666666 | 0 |
| 0.7611111111111111 | 0 |
| 0.7618055555555556 | 0 |
| 0.7625000000000001 | 0 |
| 0.7631944444444444 | 0 |
| 0.7638888888888888 | 0 |
| 0.7645833333333334 | 0 |
| 0.7652777777777778 | 0 |
| 0.7659722222222222 | 0 |
| 0.7666666666666666 | 0 |
| 0.7673611111111112 | 0 |
| 0.7680555555555556 | 0 |
| 0.7687499999999999 | 0 |
| 0.7694444444444444 | 0 |
| 0.7701388888888889 | 0 |
| 0.7708333333333334 | 0 |
| 0.7715277777777777 | 0 |
| 0.7722222222222223 | 0 |
| 0.7729166666666667 | 0 |
| 0.7736111111111111 | 0 |
| 0.7743055555555555 | 0 |
| 0.775 | 0 |
| 0.7756944444444445 | 0 |
| 0.7763888888888889 | 0 |
| 0.7770833333333332 | 0 |
| 0.7777777777777778 | 0 |
| 0.7784722222222222 | 0 |
| 0.7791666666666667 | 0 |
| 0.779861111111111 | 0 |
| 0.7805555555555556 | 0 |
| 0.78125 | 0 |
| 0.7819444444444444 | 0 |
| 0.782638888888889 | 0 |
| 0.7833333333333333 | 0 |
| 0.7840277777777778 | 0 |
| 0.7847222222222222 | 0 |
| 0.7854166666666668 | 0 |
| 0.7861111111111111 | 0 |
| 0.7868055555555555 | 0 |
| 0.7875 | 0 |
| 0.7881944444444445 | 0 |
| 0.7888888888888889 | 0 |
| 0.7895833333333333 | 0 |
| 0.7902777777777777 | 0 |
| 0.7909722222222223 | 0 |
| 0.7916666666666666 | 0 |
| 0.7923611111111111 | 0 |
| 0.7930555555555556 | 0 |
| 0.7937500000000001 | 0 |
| 0.7944444444444444 | 0 |
| 0.7951388888888888 | 0 |
| 0.7958333333333334 | 0 |
| 0.7965277777777778 | 0 |
| 0.7972222222222222 | 0 |
| 0.7979166666666666 | 0 |
| 0.7986111111111112 | 0 |
| 0.7993055555555556 | 0 |
| 0.7999999999999999 | 0 |
| 0.8006944444444444 | 0 |
| 0.8013888888888889 | 0 |
| 0.8020833333333334 | 0 |
| 0.8027777777777777 | 0 |
| 0.8034722222222223 | 0 |
| 0.8041666666666667 | 0 |
| 0.8048611111111111 | 0 |
| 0.8055555555555555 | 0 |
| 0.80625 | 0 |
| 0.8069444444444445 | 0 |
| 0.8076388888888889 | 0 |
| 0.8083333333333332 | 0 |
| 0.8090277777777778 | 0 |
| 0.8097222222222222 | 0 |
| 0.8104166666666667 | 0 |
| 0.811111111111111 | 0 |
| 0.8118055555555556 | 0 |
| 0.8125 | 0 |
| 0.8131944444444444 | 0 |
| 0.813888888888889 | 0 |
| 0.8145833333333333 | 0 |
| 0.8152777777777778 | 0 |
| 0.8159722222222222 | 0 |
| 0.8166666666666668 | 0 |
| 0.8173611111111111 | 0 |
| 0.8180555555555555 | 0 |
| 0.81875 | 0 |
| 0.8194444444444445 | 0 |
| 0.8201388888888889 | 0 |
| 0.8208333333333333 | 0 |
| 0.8215277777777777 | 0 |
| 0.8222222222222223 | 0 |
| 0.8229166666666666 | 0 |
| 0.8236111111111111 | 0 |
| 0.8243055555555556 | 0 |
| 0.8250000000000001 | 0 |
| 0.8256944444444444 | 0 |
| 0.8263888888888888 | 0 |
| 0.8270833333333334 | 0 |
| 0.8277777777777778 | 0 |
| 0.8284722222222222 | 0 |
| 0.8291666666666666 | 0 |
| 0.8298611111111112 | 0 |
| 0.8305555555555556 | 0 |
| 0.8312499999999999 | 0 |
| 0.8319444444444444 | 0 |
| 0.8326388888888889 | 0 |
| 0.8333333333333334 | 0 |
| 0.8340277777777777 | 0 |
| 0.8347222222222223 | 0 |
| 0.8354166666666667 | 0 |
| 0.8361111111111111 | 0 |
| 0.8368055555555555 | 0 |
| 0.8375 | 0 |
| 0.8381944444444445 | 0 |
| 0.8388888888888889 | 0 |
| 0.8395833333333332 | 0 |
| 0.8402777777777778 | 0 |
| 0.8409722222222222 | 0 |
| 0.8416666666666667 | 0 |
| 0.842361111111111 | 0 |
| 0.8430555555555556 | 0 |
| 0.84375 | 0 |
| 0.8444444444444444 | 0 |
| 0.845138888888889 | 0 |
| 0.8458333333333333 | 0 |
| 0.8465277777777778 | 0 |
| 0.8472222222222222 | 0 |
| 0.8479166666666668 | 0 |
| 0.8486111111111111 | 0 |
| 0.8493055555555555 | 0 |
| 0.85 | 0 |
| 0.8506944444444445 | 0 |
| 0.8513888888888889 | 0 |
| 0.8520833333333333 | 0 |
| 0.8527777777777777 | 0 |
| 0.8534722222222223 | 0 |
| 0.8541666666666666 | 0 |
| 0.8548611111111111 | 0 |
| 0.8555555555555556 | 0 |
| 0.8562500000000001 | 0 |
| 0.8569444444444444 | 0 |
| 0.8576388888888888 | 0 |
| 0.8583333333333334 | 0 |
| 0.8590277777777778 | 0 |
| 0.8597222222222222 | 0 |
| 0.8604166666666666 | 0 |
| 0.8611111111111112 | 0 |
| 0.8618055555555556 | 0 |
| 0.8624999999999999 | 0 |
| 0.8631944444444444 | 0 |
| 0.8638888888888889 | 0 |
| 0.8645833333333334 | 0 |
| 0.8652777777777777 | 0 |
| 0.8659722222222223 | 0 |
| 0.8666666666666667 | 0 |
| 0.8673611111111111 | 0 |
| 0.8680555555555555 | 0 |
| 0.86875 | 0 |
| 0.8694444444444445 | 0 |
| 0.8701388888888889 | 0 |
| 0.8708333333333332 | 0 |
| 0.8715277777777778 | 0 |
| 0.8722222222222222 | 0 |
| 0.8729166666666667 | 0 |
| 0.873611111111111 | 0 |
| 0.8743055555555556 | 0 |
| 0.875 | 0 |
| 0.8756944444444444 | 0 |
| 0.876388888888889 | 0 |
| 0.8770833333333333 | 0 |
| 0.8777777777777778 | 0 |
| 0.8784722222222222 | 0 |
| 0.8791666666666668 | 0 |
| 0.8798611111111111 | 0 |
| 0.8805555555555555 | 0 |
| 0.88125 | 0 |
| 0.8819444444444445 | 0 |
| 0.8826388888888889 | 0 |
| 0.8833333333333333 | 0 |
| 0.8840277777777777 | 0 |
| 0.8847222222222223 | 0 |
| 0.8854166666666666 | 0 |
| 0.8861111111111111 | 0 |
| 0.8868055555555556 | 0 |
| 0.8875000000000001 | 0 |
| 0.8881944444444444 | 0 |
| 0.8888888888888888 | 0 |
| 0.8895833333333334 | 0 |
| 0.8902777777777778 | 0 |
| 0.8909722222222222 | 0 |
| 0.8916666666666666 | 0 |
| 0.8923611111111112 | 0 |
| 0.8930555555555556 | 0 |
| 0.8937499999999999 | 0 |
| 0.8944444444444444 | 0 |
| 0.8951388888888889 | 0 |
| 0.8958333333333334 | 0 |
| 0.8965277777777777 | 0 |
| 0.8972222222222223 | 0 |
| 0.8979166666666667 | 0 |
| 0.8986111111111111 | 0 |
| 0.8993055555555555 | 0 |
| 0.9 | 0 |
| 0.9006944444444445 | 0 |
| 0.9013888888888889 | 0 |
| 0.9020833333333332 | 0 |
| 0.9027777777777778 | 0 |
| 0.9034722222222222 | 0 |
| 0.9041666666666667 | 0 |
| 0.904861111111111 | 0 |
| 0.9055555555555556 | 0 |
| 0.90625 | 0 |
| 0.9069444444444444 | 0 |
| 0.907638888888889 | 0 |
| 0.9083333333333333 | 0 |
| 0.9090277777777778 | 0 |
| 0.9097222222222222 | 0 |
| 0.9104166666666668 | 0 |
| 0.9111111111111111 | 0 |
| 0.9118055555555555 | 0 |
| 0.9125 | 0 |
| 0.9131944444444445 | 0 |
| 0.9138888888888889 | 0 |
| 0.9145833333333333 | 0 |
| 0.9152777777777777 | 0 |
| 0.9159722222222223 | 0 |
| 0.9166666666666666 | 0 |
| 0.9173611111111111 | 0 |
| 0.9180555555555556 | 0 |
| 0.9187500000000001 | 0 |
| 0.9194444444444444 | 0 |
| 0.9201388888888888 | 0 |
| 0.9208333333333334 | 0 |
| 0.9215277777777778 | 0 |
| 0.9222222222222222 | 0 |
| 0.9229166666666666 | 0 |
| 0.9236111111111112 | 0 |
| 0.9243055555555556 | 0 |
| 0.9249999999999999 | 0 |
| 0.9256944444444444 | 0 |
| 0.9263888888888889 | 0 |
| 0.9270833333333334 | 0 |
| 0.9277777777777777 | 0 |
| 0.9284722222222223 | 0 |
| 0.9291666666666667 | 0 |
| 0.9298611111111111 | 0 |
| 0.9305555555555555 | 0 |
| 0.93125 | 0 |
| 0.9319444444444445 | 0 |
| 0.9326388888888889 | 0 |
| 0.9333333333333332 | 0 |
| 0.9340277777777778 | 0 |
| 0.9347222222222222 | 0 |
| 0.9354166666666667 | 0 |
| 0.936111111111111 | 0 |
| 0.9368055555555556 | 0 |
| 0.9375 | 0 |
| 0.9381944444444444 | 0 |
| 0.938888888888889 | 0 |
| 0.9395833333333333 | 0 |
| 0.9402777777777778 | 0 |
| 0.9409722222222222 | 0 |
| 0.9416666666666668 | 0 |
| 0.9423611111111111 | 0 |
| 0.9430555555555555 | 0 |
| 0.94375 | 0 |
| 0.9444444444444445 | 0 |
| 0.9451388888888889 | 0 |
| 0.9458333333333333 | 0 |
| 0.9465277777777777 | 0 |
| 0.9472222222222223 | 0 |
| 0.9479166666666666 | 0 |
| 0.9486111111111111 | 0 |
| 0.9493055555555556 | 0 |
| 0.9500000000000001 | 0 |
| 0.9506944444444444 | 0 |
| 0.9513888888888888 | 0 |
| 0.9520833333333334 | 0 |
| 0.9527777777777778 | 0 |
| 0.9534722222222222 | 0 |
| 0.9541666666666666 | 0 |
| 0.9548611111111112 | 0 |
| 0.9555555555555556 | 0 |
| 0.9562499999999999 | 0 |
| 0.9569444444444444 | 0 |
| 0.9576388888888889 | 0 |
| 0.9583333333333334 | 0 |
| 0.9590277777777777 | 0 |
| 0.9597222222222223 | 0 |
| 0.9604166666666667 | 0 |
| 0.9611111111111111 | 0 |
| 0.9618055555555555 | 0 |
| 0.9625 | 0 |
| 0.9631944444444445 | 0 |
| 0.9638888888888889 | 0 |
| 0.9645833333333332 | 0 |
| 0.9652777777777778 | 0 |
| 0.9659722222222222 | 0 |
| 0.9666666666666667 | 0 |
| 0.967361111111111 | 0 |
| 0.9680555555555556 | 0 |
| 0.96875 | 0 |
| 0.9694444444444444 | 0 |
| 0.970138888888889 | 0 |
| 0.9708333333333333 | 0 |
| 0.9715277777777778 | 0 |
| 0.9722222222222222 | 0 |
| 0.9729166666666668 | 0 |
| 0.9736111111111111 | 0 |
| 0.9743055555555555 | 0 |
| 0.975 | 0 |
| 0.9756944444444445 | 0 |
| 0.9763888888888889 | 0 |
| 0.9770833333333333 | 0 |
| 0.9777777777777777 | 0 |
| 0.9784722222222223 | 0 |
| 0.9791666666666666 | 0 |
| 0.9798611111111111 | 0 |
| 0.9805555555555556 | 0 |
| 0.9812500000000001 | 0 |
| 0.9819444444444444 | 0 |
| 0.9826388888888888 | 0 |
| 0.9833333333333334 | 0 |
| 0.9840277777777778 | 0 |
| 0.9847222222222222 | 0 |
| 0.9854166666666666 | 0 |
| 0.9861111111111112 | 0 |
| 0.9868055555555556 | 0 |
| 0.9874999999999999 | 0 |
| 0.9881944444444444 | 0 |
| 0.9888888888888889 | 0 |
| 0.9895833333333334 | 0 |
| 0.9902777777777777 | 0 |
| 0.9909722222222223 | 0 |
| 0.9916666666666667 | 0 |
| 0.9923611111111111 | 0 |
| 0.9930555555555555 | 0 |
| 0.99375 | 0 |
| 0.9944444444444445 | 0 |
| 0.9951388888888889 | 0 |
| 0.9958333333333332 | 0 |
| 0.9965277777777778 | 0 |
| 0.9972222222222222 | 0 |
| 0.9979166666666667 | 0 |
| 0.998611111111111 | 0 |
| 0.9993055555555556 | 0 |